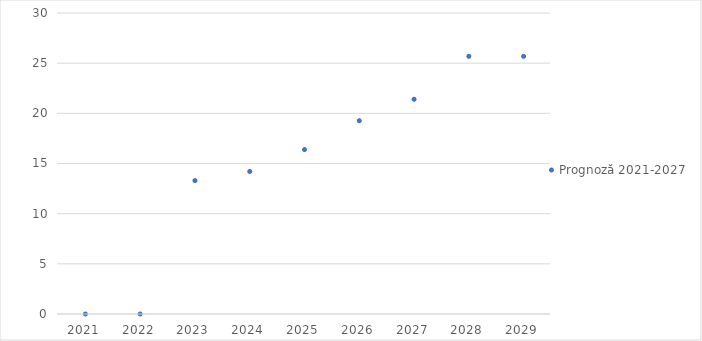
| Category | Prognoză 2021-2027 |
|---|---|
| 2021.0 | 0 |
| 2022.0 | 0 |
| 2023.0 | 13.296 |
| 2024.0 | 14.207 |
| 2025.0 | 16.392 |
| 2026.0 | 19.261 |
| 2027.0 | 21.401 |
| 2028.0 | 25.681 |
| 2029.0 | 25.681 |